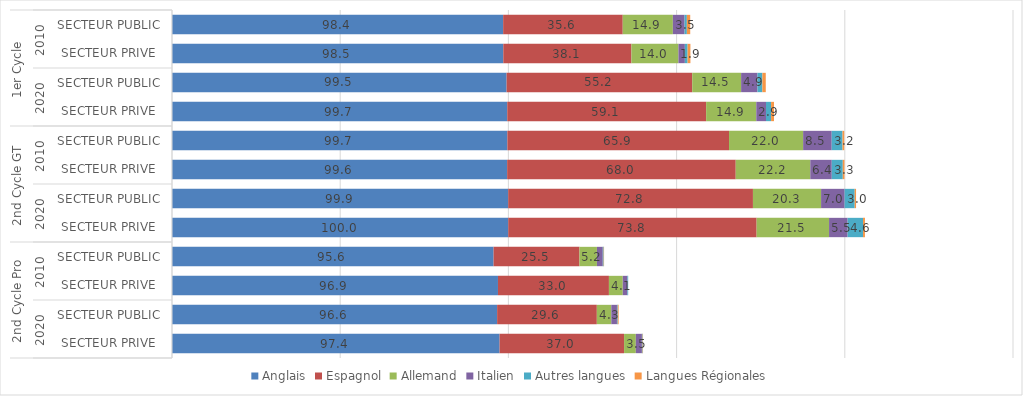
| Category | Anglais | Espagnol | Allemand | Italien | Autres langues | Langues Régionales |
|---|---|---|---|---|---|---|
| 0 | 98.439 | 35.553 | 14.897 | 3.48 | 0.68 | 0.999 |
| 1 | 98.48 | 38.088 | 13.976 | 1.911 | 0.813 | 0.837 |
| 2 | 99.463 | 55.182 | 14.534 | 4.871 | 1.447 | 1.007 |
| 3 | 99.659 | 59.12 | 14.906 | 2.888 | 1.511 | 0.877 |
| 4 | 99.693 | 65.892 | 22.028 | 8.498 | 3.206 | 0.514 |
| 5 | 99.627 | 67.952 | 22.158 | 6.392 | 3.269 | 0.5 |
| 6 | 99.942 | 72.753 | 20.256 | 6.997 | 2.998 | 0.396 |
| 7 | 99.954 | 73.838 | 21.528 | 5.525 | 4.575 | 0.569 |
| 8 | 95.594 | 25.534 | 5.189 | 1.735 | 0.263 | 0.119 |
| 9 | 96.9 | 32.983 | 4.111 | 1.396 | 0.214 | 0.001 |
| 10 | 96.646 | 29.644 | 4.301 | 1.683 | 0.224 | 0.271 |
| 11 | 97.383 | 37.003 | 3.493 | 1.804 | 0.208 | 0.126 |